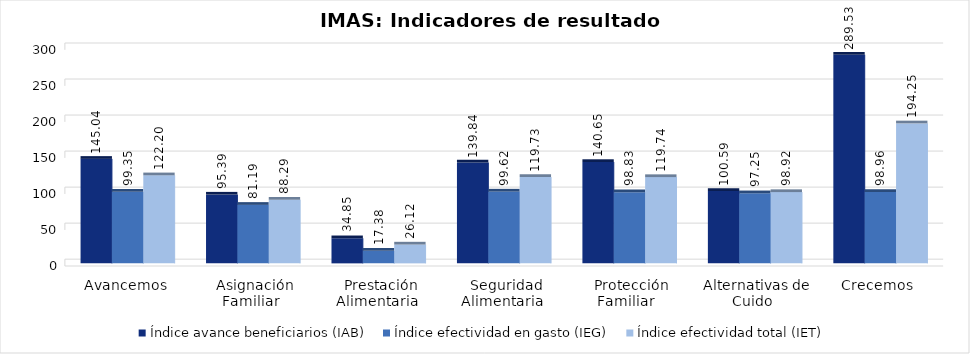
| Category | Índice avance beneficiarios (IAB)  | Índice efectividad en gasto (IEG)  | Índice efectividad total (IET) |
|---|---|---|---|
| Avancemos | 145.043 | 99.348 | 122.195 |
| Asignación Familiar | 95.395 | 81.188 | 88.291 |
| Prestación Alimentaria | 34.848 | 17.383 | 26.116 |
| Seguridad Alimentaria | 139.843 | 99.622 | 119.732 |
| Protección Familiar  | 140.647 | 98.83 | 119.738 |
| Alternativas de Cuido | 100.594 | 97.252 | 98.923 |
| Crecemos  | 289.535 | 98.956 | 194.246 |